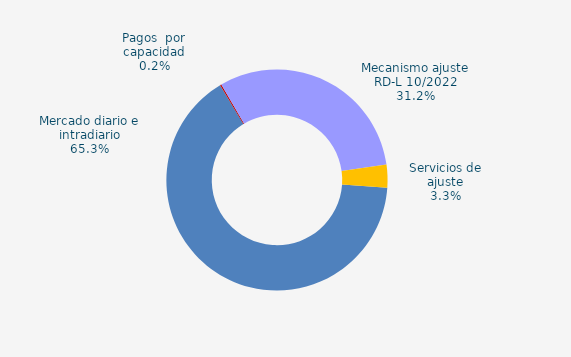
| Category | Series 0 |
|---|---|
| Mercado diario e intradiario | 142.38 |
| Pagos  por capacidad | 0.43 |
| Mecanismo ajuste RD-L 10/2022 | 67.984 |
| Servicios de ajuste | 7.284 |